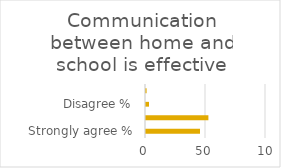
| Category | Series 1 |
|---|---|
| Strongly agree % | 45 |
| Agree % | 52 |
| Disagree % | 2.5 |
| Strongly disagree % | 0.5 |